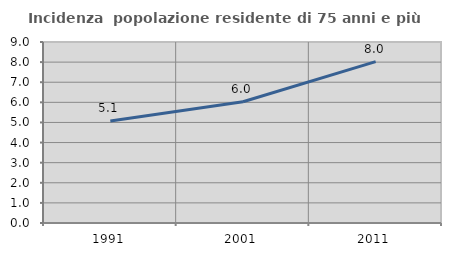
| Category | Incidenza  popolazione residente di 75 anni e più |
|---|---|
| 1991.0 | 5.074 |
| 2001.0 | 6.029 |
| 2011.0 | 8.027 |